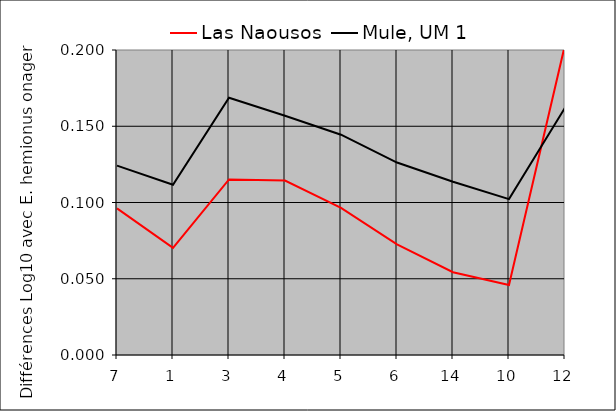
| Category | Las Naousos | Mule, UM 1 |
|---|---|---|
| 7.0 | 0.096 | 0.124 |
| 1.0 | 0.07 | 0.112 |
| 3.0 | 0.115 | 0.169 |
| 4.0 | 0.114 | 0.157 |
| 5.0 | 0.096 | 0.144 |
| 6.0 | 0.072 | 0.126 |
| 14.0 | 0.054 | 0.114 |
| 10.0 | 0.046 | 0.102 |
| 12.0 | 0.203 | 0.162 |